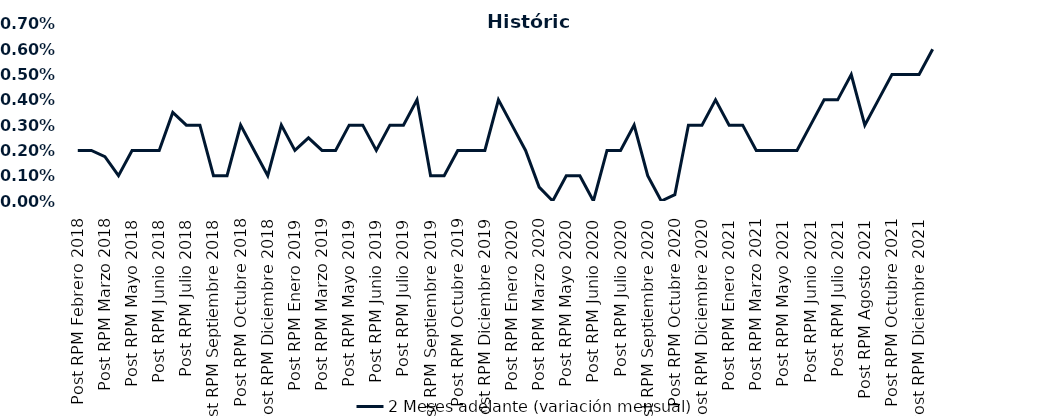
| Category | 2 Meses adelante (variación mensual) |
|---|---|
| Post RPM Febrero 2018 | 0.002 |
| Pre RPM Marzo 2018 | 0.002 |
| Post RPM Marzo 2018 | 0.002 |
| Pre RPM Mayo 2018 | 0.001 |
| Post RPM Mayo 2018 | 0.002 |
| Pre RPM Junio 2018 | 0.002 |
| Post RPM Junio 2018 | 0.002 |
| Pre RPM Julio 2018 | 0.004 |
| Post RPM Julio 2018 | 0.003 |
| Pre RPM Septiembre 2018 | 0.003 |
| Post RPM Septiembre 2018 | 0.001 |
| Pre RPM Octubre 2018 | 0.001 |
| Post RPM Octubre 2018 | 0.003 |
| Pre RPM Diciembre 2018 | 0.002 |
| Post RPM Diciembre 2018 | 0.001 |
| Pre RPM Enero 2019 | 0.003 |
| Post RPM Enero 2019 | 0.002 |
| Pre RPM Marzo 2019 | 0.002 |
| Post RPM Marzo 2019 | 0.002 |
| Pre RPM Mayo 2019 | 0.002 |
| Post RPM Mayo 2019 | 0.003 |
| Pre RPM Junio 2019 | 0.003 |
| Post RPM Junio 2019 | 0.002 |
| Pre RPM Julio 2019 | 0.003 |
| Post RPM Julio 2019 | 0.003 |
| Pre RPM Septiembre 2019 | 0.004 |
| Post RPM Septiembre 2019 | 0.001 |
| Pre RPM Octubre 2019 | 0.001 |
| Post RPM Octubre 2019 | 0.002 |
| Pre RPM Diciembre 2019 | 0.002 |
| Post RPM Diciembre 2019 | 0.002 |
| Pre RPM Enero 2020 | 0.004 |
| Post RPM Enero 2020 | 0.003 |
| Pre RPM Marzo 2020 | 0.002 |
| Post RPM Marzo 2020 | 0.001 |
| Pre RPM Mayo 2020 | 0 |
| Post RPM Mayo 2020 | 0.001 |
| Pre RPM Junio 2020 | 0.001 |
| Post RPM Junio 2020 | 0 |
| Pre RPM Julio 2020 | 0.002 |
| Post RPM Julio 2020 | 0.002 |
| Pre RPM Septiembre 2020 | 0.003 |
| Post RPM Septiembre 2020 | 0.001 |
| Pre RPM Octubre 2020 | 0 |
| Post RPM Octubre 2020 | 0 |
| Pre RPM Diciembre 2020 | 0.003 |
| Post RPM Diciembre 2020 | 0.003 |
| Pre RPM Enero 2021 | 0.004 |
| Post RPM Enero 2021 | 0.003 |
| Pre RPM Marzo 2021 | 0.003 |
| Post RPM Marzo 2021 | 0.002 |
| Pre RPM Mayo 2021 | 0.002 |
| Post RPM Mayo 2021 | 0.002 |
| Pre RPM Junio 2021 | 0.002 |
| Post RPM Junio 2021 | 0.003 |
| Pre RPM Julio 2021 | 0.004 |
| Post RPM Julio 2021 | 0.004 |
| Pre RPM Agosto 2021 | 0.005 |
| Post RPM Agosto 2021 | 0.003 |
| Pre RPM Octubre 2021 | 0.004 |
| Post RPM Octubre 2021 | 0.005 |
| Pre RPM Diciembre 2021 | 0.005 |
| Post RPM Diciembre 2021 | 0.005 |
| Pre RPM Enero 2022 | 0.006 |